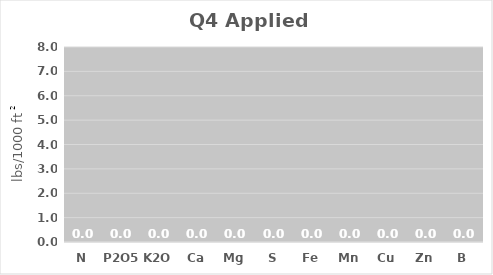
| Category | Q4 Applied Nutrients |
|---|---|
| N | 0 |
| P2O5 | 0 |
| K2O | 0 |
| Ca | 0 |
| Mg | 0 |
| S | 0 |
| Fe | 0 |
| Mn | 0 |
| Cu | 0 |
| Zn | 0 |
| B | 0 |